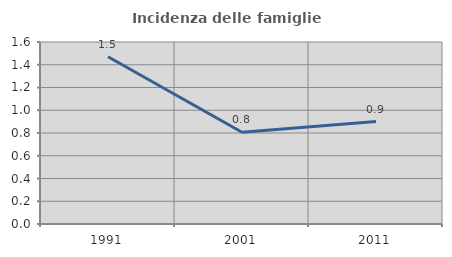
| Category | Incidenza delle famiglie numerose |
|---|---|
| 1991.0 | 1.471 |
| 2001.0 | 0.806 |
| 2011.0 | 0.901 |